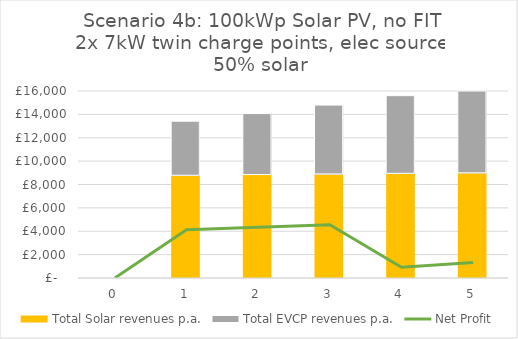
| Category | Total Solar revenues p.a. | Total EVCP revenues p.a. |
|---|---|---|
| 0.0 | 0 | 0 |
| 1.0 | 8750 | 4666.667 |
| 2.0 | 8807.81 | 5261.667 |
| 3.0 | 8861.934 | 5932.529 |
| 4.0 | 8911.837 | 6688.927 |
| 5.0 | 8956.931 | 7541.765 |